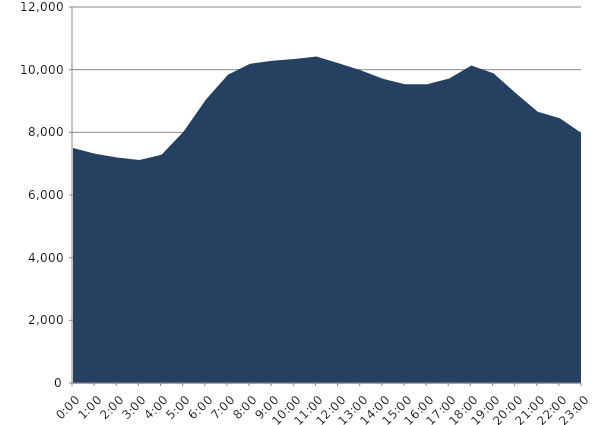
| Category | Series 0 | Series 1 |
|---|---|---|
| 2022-03-16 |  | 7502.462 |
| 2022-03-16 01:00:00 |  | 7319.37 |
| 2022-03-16 02:00:00 |  | 7194.141 |
| 2022-03-16 03:00:00 |  | 7114.632 |
| 2022-03-16 04:00:00 |  | 7283.735 |
| 2022-03-16 05:00:00 |  | 8029.48 |
| 2022-03-16 06:00:00 |  | 9038.614 |
| 2022-03-16 07:00:00 |  | 9839.142 |
| 2022-03-16 08:00:00 |  | 10187.89 |
| 2022-03-16 09:00:00 |  | 10282.062 |
| 2022-03-16 10:00:00 |  | 10342.937 |
| 2022-03-16 11:00:00 |  | 10423.805 |
| 2022-03-16 12:00:00 |  | 10203.457 |
| 2022-03-16 13:00:00 |  | 9977.84 |
| 2022-03-16 14:00:00 |  | 9706.51 |
| 2022-03-16 15:00:00 |  | 9536.249 |
| 2022-03-16 16:00:00 |  | 9534.309 |
| 2022-03-16 17:00:00 |  | 9714.445 |
| 2022-03-16 18:00:00 |  | 10131.375 |
| 2022-03-16 19:00:00 |  | 9885.932 |
| 2022-03-16 20:00:00 |  | 9258.701 |
| 2022-03-16 21:00:00 |  | 8660.476 |
| 2022-03-16 22:00:00 |  | 8448.364 |
| 2022-03-16 23:00:00 |  | 7967.625 |